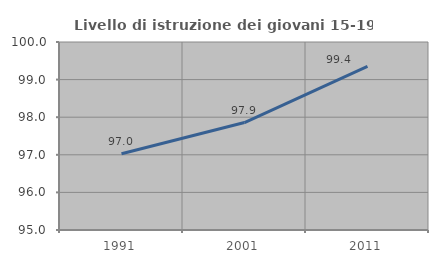
| Category | Livello di istruzione dei giovani 15-19 anni |
|---|---|
| 1991.0 | 97.03 |
| 2001.0 | 97.857 |
| 2011.0 | 99.351 |